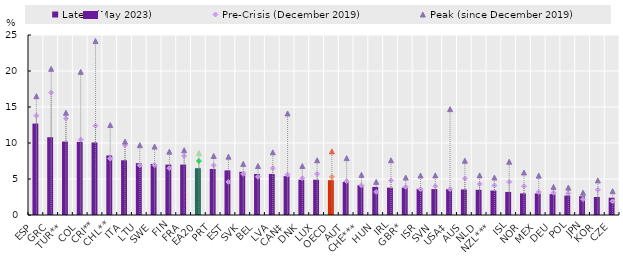
| Category | Latest (May 2023) |
|---|---|
| ESP | 12.7 |
| GRC | 10.8 |
| TUR** | 10.2 |
| COL | 10.154 |
| CRI** | 10.071 |
| CHL** | 8.269 |
| ITA | 7.6 |
| LTU | 7.2 |
| SWE | 7.1 |
| FIN | 7 |
| FRA | 7 |
| EA20 | 6.5 |
| PRT | 6.4 |
| EST | 6.2 |
| SVK | 6 |
| BEL | 5.7 |
| LVA | 5.7 |
| CAN‡ | 5.4 |
| DNK | 4.9 |
| LUX | 4.9 |
| OECD | 4.839 |
| AUT | 4.6 |
| CHE*** | 4.156 |
| HUN | 3.9 |
| IRL | 3.8 |
| GBR* | 3.8 |
| ISR | 3.63 |
| SVN | 3.6 |
| USA‡ | 3.6 |
| AUS | 3.551 |
| NLD | 3.5 |
| NZL*** | 3.4 |
| ISL | 3.2 |
| NOR | 3 |
| MEX | 2.992 |
| DEU | 2.9 |
| POL | 2.7 |
| JPN | 2.6 |
| KOR | 2.5 |
| CZE | 2.4 |